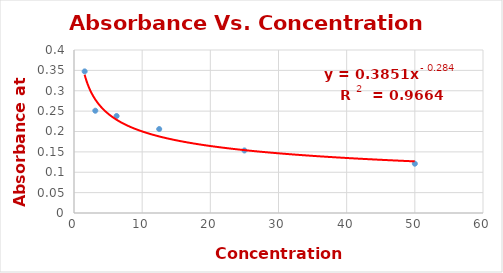
| Category | Series 0 |
|---|---|
| 50.0 | 0.121 |
| 25.0 | 0.154 |
| 12.5 | 0.206 |
| 6.25 | 0.238 |
| 3.125 | 0.251 |
| 1.5625 | 0.348 |